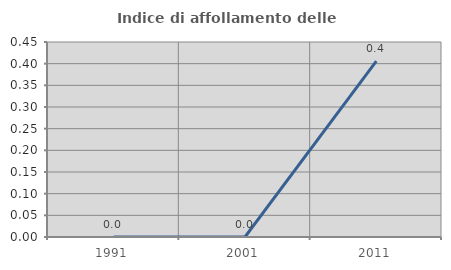
| Category | Indice di affollamento delle abitazioni  |
|---|---|
| 1991.0 | 0 |
| 2001.0 | 0 |
| 2011.0 | 0.406 |